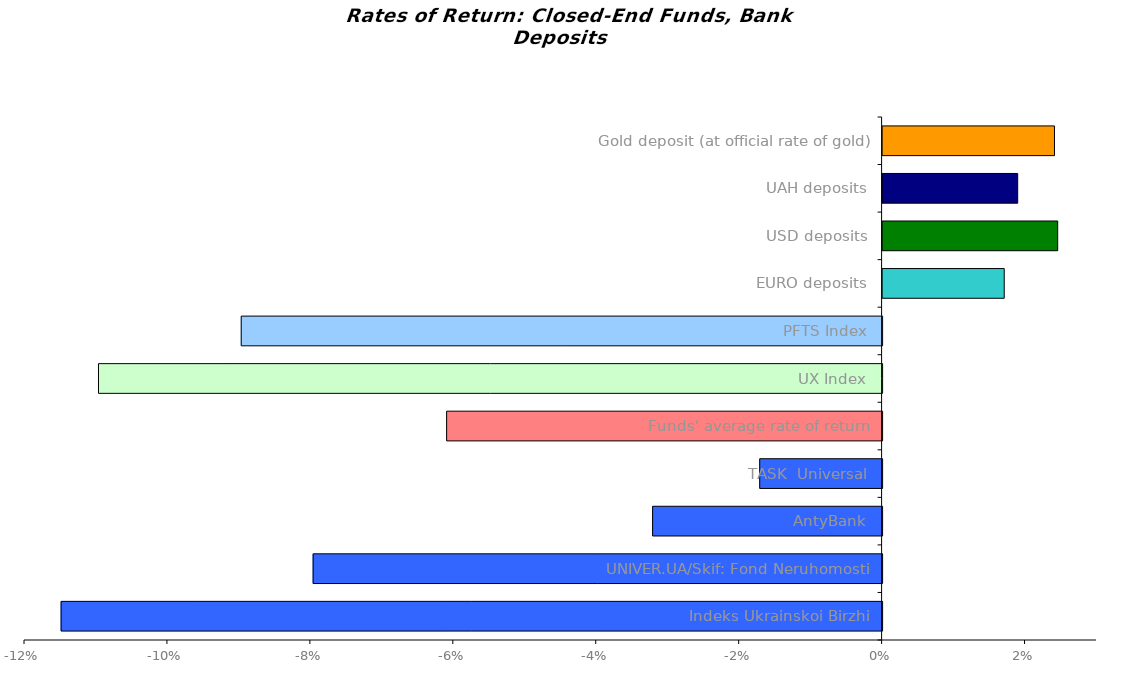
| Category | Series 0 |
|---|---|
| Indeks Ukrainskoi Birzhi | -0.115 |
| UNIVER.UA/Skif: Fond Neruhomosti | -0.08 |
| AntyBank | -0.032 |
| TASK  Universal | -0.017 |
| Funds' average rate of return | -0.061 |
| UX Index | -0.11 |
| PFTS Index | -0.09 |
| EURO deposits | 0.017 |
| USD deposits | 0.024 |
| UAH deposits | 0.019 |
| Gold deposit (at official rate of gold) | 0.024 |